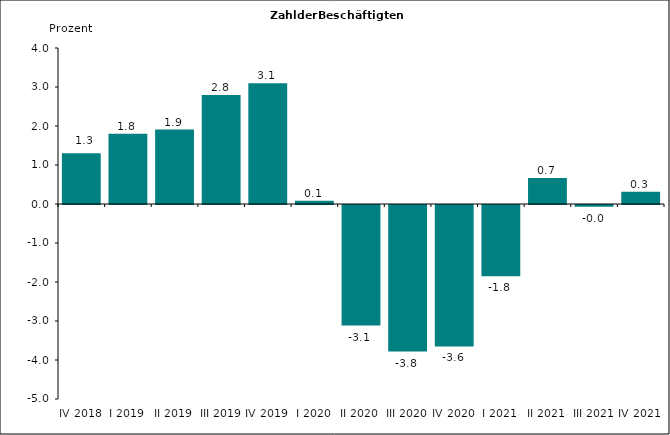
| Category | Series 0 |
|---|---|
| IV 2018 | 1.3 |
| I 2019 | 1.8 |
| II 2019 | 1.91 |
| III 2019 | 2.793 |
| IV 2019 | 3.093 |
| I 2020 | 0.085 |
| II 2020 | -3.091 |
| III 2020 | -3.759 |
| IV 2020 | -3.628 |
| I 2021 | -1.825 |
| II 2021 | 0.67 |
| III 2021 | -0.044 |
| IV 2021 | 0.311 |